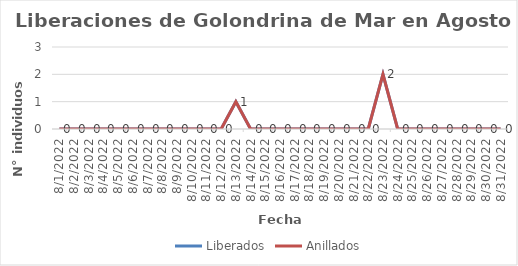
| Category | Liberados | Anillados |
|---|---|---|
| 8/1/22 | 0 | 0 |
| 8/2/22 | 0 | 0 |
| 8/3/22 | 0 | 0 |
| 8/4/22 | 0 | 0 |
| 8/5/22 | 0 | 0 |
| 8/6/22 | 0 | 0 |
| 8/7/22 | 0 | 0 |
| 8/8/22 | 0 | 0 |
| 8/9/22 | 0 | 0 |
| 8/10/22 | 0 | 0 |
| 8/11/22 | 0 | 0 |
| 8/12/22 | 0 | 0 |
| 8/13/22 | 1 | 1 |
| 8/14/22 | 0 | 0 |
| 8/15/22 | 0 | 0 |
| 8/16/22 | 0 | 0 |
| 8/17/22 | 0 | 0 |
| 8/18/22 | 0 | 0 |
| 8/19/22 | 0 | 0 |
| 8/20/22 | 0 | 0 |
| 8/21/22 | 0 | 0 |
| 8/22/22 | 0 | 0 |
| 8/23/22 | 2 | 2 |
| 8/24/22 | 0 | 0 |
| 8/25/22 | 0 | 0 |
| 8/26/22 | 0 | 0 |
| 8/27/22 | 0 | 0 |
| 8/28/22 | 0 | 0 |
| 8/29/22 | 0 | 0 |
| 8/30/22 | 0 | 0 |
| 8/31/22 | 0 | 0 |